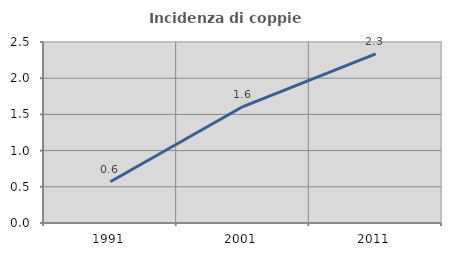
| Category | Incidenza di coppie miste |
|---|---|
| 1991.0 | 0.57 |
| 2001.0 | 1.608 |
| 2011.0 | 2.335 |